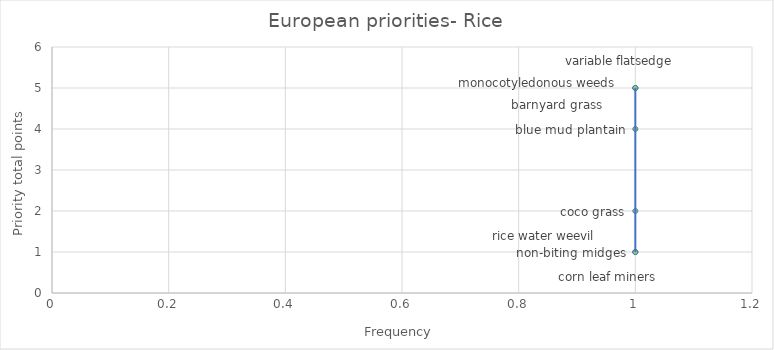
| Category | Series 0 |
|---|---|
| 1.0 | 5 |
| 1.0 | 5 |
| 1.0 | 5 |
| 1.0 | 4 |
| 1.0 | 2 |
| 1.0 | 1 |
| 1.0 | 1 |
| 1.0 | 1 |